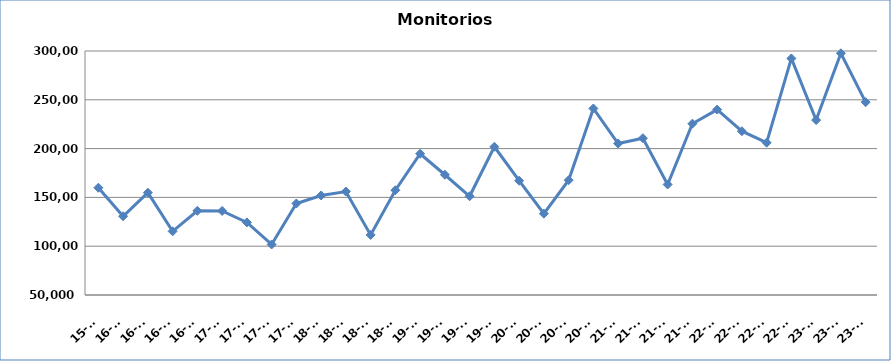
| Category | Monitorios ingresados |
|---|---|
| 15-T4 | 159890 |
| 16-T1 | 130680 |
| 16-T2 | 154860 |
| 16-T3 | 115269 |
| 16-T4 | 136245 |
| 17-T1 | 136155 |
| 17-T2 | 124382 |
| 17-T3 | 101751 |
| 17-T4 | 143788 |
| 18-T1 | 151974 |
| 18-T2 | 155991 |
| 18-T3 | 111544 |
| 18-T4 | 157337 |
| 19-T1 | 194715 |
| 19-T2 | 173225 |
| 19-T3 | 151156 |
| 19-T4 | 201895 |
| 20-T1 | 167095 |
| 20-T2 | 133351 |
| 20-T3 | 167630 |
| 20-T4 | 241119 |
| 21-T1 | 205212 |
| 21-T2 | 210679 |
| 21-T3 | 163259 |
| 21-T4 | 225536 |
| 22-T1 | 239972 |
| 22-T2 | 217801 |
| 22-T3 | 206093 |
| 22-T4 | 292388 |
| 23-T1 | 229190 |
| 23-T2 | 297658 |
| 23-T3 | 247601 |